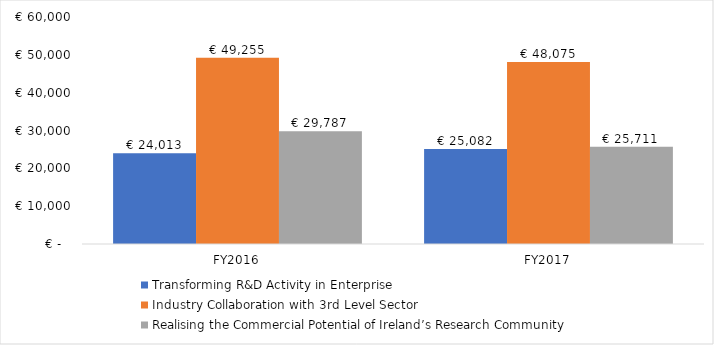
| Category | Transforming R&D Activity in Enterprise | Industry Collaboration with 3rd Level Sector | Realising the Commercial Potential of Ireland’s Research Community |
|---|---|---|---|
| FY2016 | 24013 | 49255 | 29787 |
| FY2017 | 25082 | 48075 | 25711 |